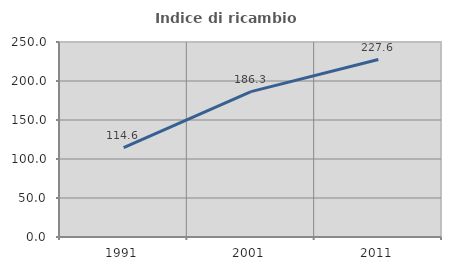
| Category | Indice di ricambio occupazionale  |
|---|---|
| 1991.0 | 114.65 |
| 2001.0 | 186.325 |
| 2011.0 | 227.559 |